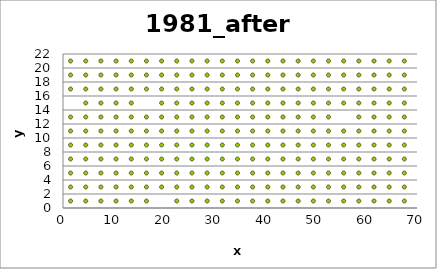
| Category | Series 0 |
|---|---|
| 1.5 | 1 |
| 4.5 | 1 |
| 7.5 | 1 |
| 10.5 | 1 |
| 13.5 | 1 |
| 16.5 | 1 |
| 22.5 | 1 |
| 25.5 | 1 |
| 28.5 | 1 |
| 31.5 | 1 |
| 34.5 | 1 |
| 37.5 | 1 |
| 40.5 | 1 |
| 43.5 | 1 |
| 46.5 | 1 |
| 49.5 | 1 |
| 52.5 | 1 |
| 55.5 | 1 |
| 58.5 | 1 |
| 61.5 | 1 |
| 64.5 | 1 |
| 67.5 | 1 |
| 70.5 | 1 |
| 1.5 | 3 |
| 4.5 | 3 |
| 7.5 | 3 |
| 10.5 | 3 |
| 13.5 | 3 |
| 16.5 | 3 |
| 19.5 | 3 |
| 22.5 | 3 |
| 25.5 | 3 |
| 28.5 | 3 |
| 31.5 | 3 |
| 34.5 | 3 |
| 37.5 | 3 |
| 40.5 | 3 |
| 43.5 | 3 |
| 46.5 | 3 |
| 49.5 | 3 |
| 52.5 | 3 |
| 55.5 | 3 |
| 58.5 | 3 |
| 61.5 | 3 |
| 64.5 | 3 |
| 67.5 | 3 |
| 70.5 | 3 |
| 1.5 | 5 |
| 4.5 | 5 |
| 7.5 | 5 |
| 10.5 | 5 |
| 13.5 | 5 |
| 16.5 | 5 |
| 19.5 | 5 |
| 22.5 | 5 |
| 25.5 | 5 |
| 28.5 | 5 |
| 31.5 | 5 |
| 34.5 | 5 |
| 37.5 | 5 |
| 40.5 | 5 |
| 43.5 | 5 |
| 46.5 | 5 |
| 49.5 | 5 |
| 52.5 | 5 |
| 55.5 | 5 |
| 58.5 | 5 |
| 61.5 | 5 |
| 64.5 | 5 |
| 67.5 | 5 |
| 70.5 | 5 |
| 1.5 | 7 |
| 4.5 | 7 |
| 7.5 | 7 |
| 10.5 | 7 |
| 13.5 | 7 |
| 16.5 | 7 |
| 19.5 | 7 |
| 22.5 | 7 |
| 25.5 | 7 |
| 28.5 | 7 |
| 31.5 | 7 |
| 34.5 | 7 |
| 37.5 | 7 |
| 40.5 | 7 |
| 43.5 | 7 |
| 46.5 | 7 |
| 49.5 | 7 |
| 52.5 | 7 |
| 55.5 | 7 |
| 58.5 | 7 |
| 61.5 | 7 |
| 64.5 | 7 |
| 67.5 | 7 |
| 70.5 | 7 |
| 1.5 | 9 |
| 4.5 | 9 |
| 7.5 | 9 |
| 10.5 | 9 |
| 13.5 | 9 |
| 16.5 | 9 |
| 19.5 | 9 |
| 22.5 | 9 |
| 25.5 | 9 |
| 28.5 | 9 |
| 31.5 | 9 |
| 34.5 | 9 |
| 37.5 | 9 |
| 40.5 | 9 |
| 43.5 | 9 |
| 46.5 | 9 |
| 49.5 | 9 |
| 52.5 | 9 |
| 55.5 | 9 |
| 58.5 | 9 |
| 61.5 | 9 |
| 64.5 | 9 |
| 67.5 | 9 |
| 70.5 | 9 |
| 1.5 | 11 |
| 4.5 | 11 |
| 7.5 | 11 |
| 10.5 | 11 |
| 13.5 | 11 |
| 16.5 | 11 |
| 19.5 | 11 |
| 22.5 | 11 |
| 25.5 | 11 |
| 28.5 | 11 |
| 31.5 | 11 |
| 34.5 | 11 |
| 37.5 | 11 |
| 40.5 | 11 |
| 43.5 | 11 |
| 46.5 | 11 |
| 49.5 | 11 |
| 52.5 | 11 |
| 55.5 | 11 |
| 58.5 | 11 |
| 61.5 | 11 |
| 64.5 | 11 |
| 67.5 | 11 |
| 70.5 | 11 |
| 1.5 | 13 |
| 4.5 | 13 |
| 7.5 | 13 |
| 10.5 | 13 |
| 13.5 | 13 |
| 16.5 | 13 |
| 19.5 | 13 |
| 22.5 | 13 |
| 25.5 | 13 |
| 28.5 | 13 |
| 31.5 | 13 |
| 34.5 | 13 |
| 37.5 | 13 |
| 40.5 | 13 |
| 43.5 | 13 |
| 46.5 | 13 |
| 49.5 | 13 |
| 52.5 | 13 |
| 58.5 | 13 |
| 61.5 | 13 |
| 64.5 | 13 |
| 67.5 | 13 |
| 70.5 | 13 |
| 4.5 | 15 |
| 7.5 | 15 |
| 10.5 | 15 |
| 13.5 | 15 |
| 19.5 | 15 |
| 22.5 | 15 |
| 25.5 | 15 |
| 28.5 | 15 |
| 31.5 | 15 |
| 34.5 | 15 |
| 37.5 | 15 |
| 40.5 | 15 |
| 43.5 | 15 |
| 46.5 | 15 |
| 49.5 | 15 |
| 52.5 | 15 |
| 55.5 | 15 |
| 58.5 | 15 |
| 61.5 | 15 |
| 64.5 | 15 |
| 67.5 | 15 |
| 70.5 | 15 |
| 1.5 | 17 |
| 4.5 | 17 |
| 7.5 | 17 |
| 10.5 | 17 |
| 13.5 | 17 |
| 16.5 | 17 |
| 19.5 | 17 |
| 22.5 | 17 |
| 25.5 | 17 |
| 28.5 | 17 |
| 31.5 | 17 |
| 34.5 | 17 |
| 37.5 | 17 |
| 40.5 | 17 |
| 43.5 | 17 |
| 46.5 | 17 |
| 49.5 | 17 |
| 52.5 | 17 |
| 55.5 | 17 |
| 58.5 | 17 |
| 61.5 | 17 |
| 64.5 | 17 |
| 67.5 | 17 |
| 70.5 | 17 |
| 1.5 | 19 |
| 4.5 | 19 |
| 7.5 | 19 |
| 10.5 | 19 |
| 13.5 | 19 |
| 16.5 | 19 |
| 19.5 | 19 |
| 22.5 | 19 |
| 25.5 | 19 |
| 28.5 | 19 |
| 31.5 | 19 |
| 34.5 | 19 |
| 37.5 | 19 |
| 40.5 | 19 |
| 43.5 | 19 |
| 46.5 | 19 |
| 49.5 | 19 |
| 52.5 | 19 |
| 55.5 | 19 |
| 58.5 | 19 |
| 61.5 | 19 |
| 64.5 | 19 |
| 67.5 | 19 |
| 70.5 | 19 |
| 1.5 | 21 |
| 4.5 | 21 |
| 7.5 | 21 |
| 10.5 | 21 |
| 13.5 | 21 |
| 16.5 | 21 |
| 19.5 | 21 |
| 22.5 | 21 |
| 25.5 | 21 |
| 28.5 | 21 |
| 31.5 | 21 |
| 34.5 | 21 |
| 37.5 | 21 |
| 40.5 | 21 |
| 43.5 | 21 |
| 46.5 | 21 |
| 49.5 | 21 |
| 52.5 | 21 |
| 55.5 | 21 |
| 58.5 | 21 |
| 61.5 | 21 |
| 64.5 | 21 |
| 67.5 | 21 |
| 70.5 | 21 |